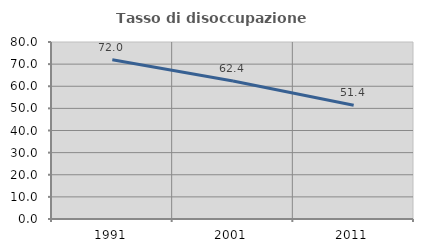
| Category | Tasso di disoccupazione giovanile  |
|---|---|
| 1991.0 | 71.966 |
| 2001.0 | 62.393 |
| 2011.0 | 51.402 |